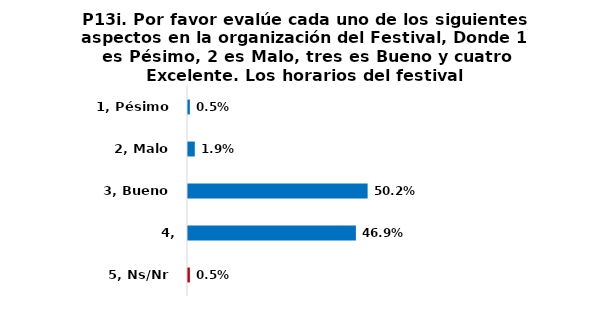
| Category | Series 0 |
|---|---|
| 1, Pésimo | 0.005 |
| 2, Malo | 0.019 |
| 3, Bueno | 0.502 |
| 4, Excelente | 0.469 |
| 5, Ns/Nr | 0.005 |